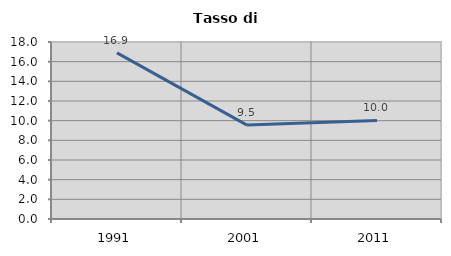
| Category | Tasso di disoccupazione   |
|---|---|
| 1991.0 | 16.89 |
| 2001.0 | 9.547 |
| 2011.0 | 10.023 |